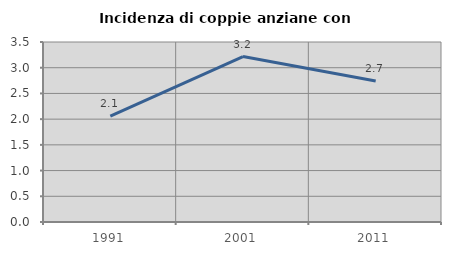
| Category | Incidenza di coppie anziane con figli |
|---|---|
| 1991.0 | 2.057 |
| 2001.0 | 3.216 |
| 2011.0 | 2.74 |